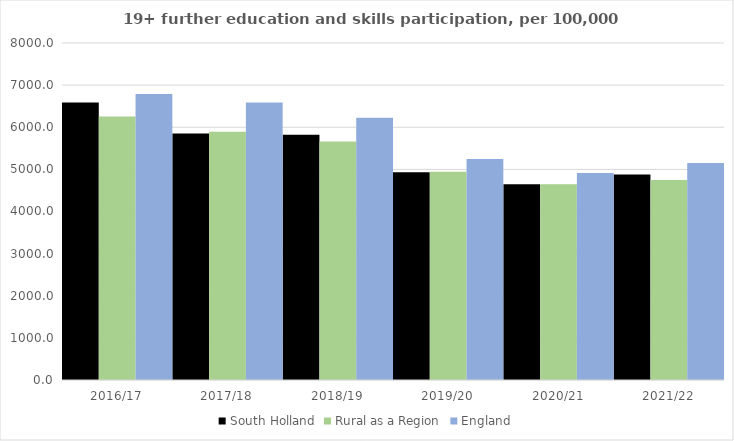
| Category | South Holland | Rural as a Region | England |
|---|---|---|---|
| 2016/17 | 6587 | 6253.401 | 6788 |
| 2017/18 | 5850 | 5892.029 | 6588 |
| 2018/19 | 5823 | 5661.873 | 6227 |
| 2019/20 | 4931 | 4943.801 | 5244 |
| 2020/21 | 4646 | 4646.727 | 4913 |
| 2021/22 | 4879 | 4747.049 | 5151 |